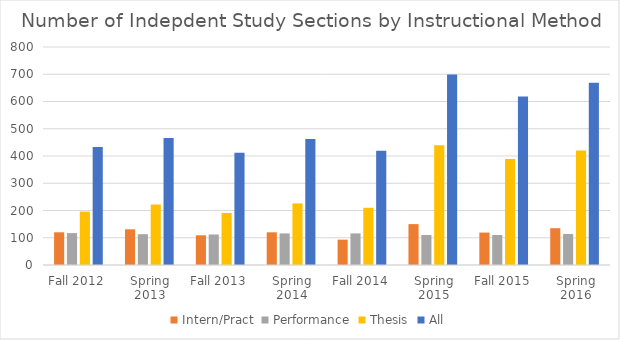
| Category | Intern/Pract | Performance | Thesis | All |
|---|---|---|---|---|
| Fall 2012 | 120 | 117 | 196 | 433 |
| Spring 2013 | 131 | 113 | 222 | 466 |
| Fall 2013 | 109 | 112 | 191 | 412 |
| Spring 2014 | 120 | 116 | 226 | 462 |
| Fall 2014 | 93 | 116 | 210 | 419 |
| Spring 2015 | 150 | 110 | 439 | 699 |
| Fall 2015 | 119 | 110 | 389 | 618 |
| Spring 2016 | 135 | 114 | 420 | 669 |